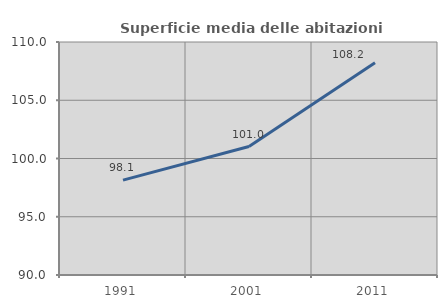
| Category | Superficie media delle abitazioni occupate |
|---|---|
| 1991.0 | 98.141 |
| 2001.0 | 101.026 |
| 2011.0 | 108.226 |